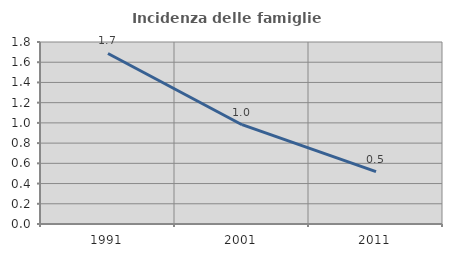
| Category | Incidenza delle famiglie numerose |
|---|---|
| 1991.0 | 1.687 |
| 2001.0 | 0.982 |
| 2011.0 | 0.517 |